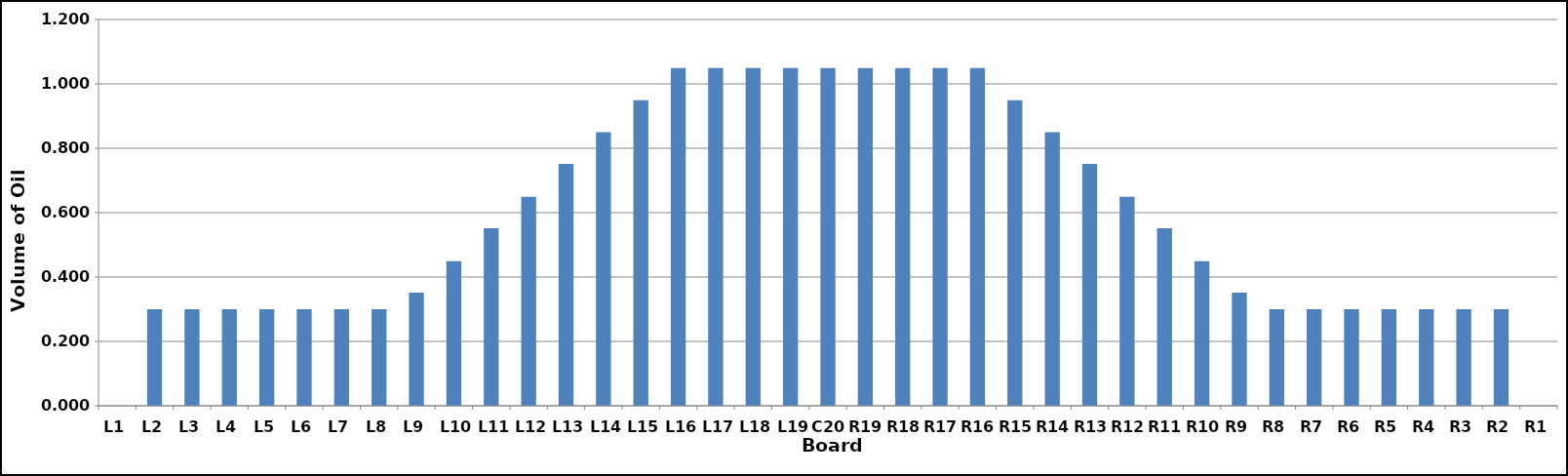
| Category | Series 0 |
|---|---|
| L1 | 0 |
| L2 | 0.3 |
| L3 | 0.3 |
| L4 | 0.3 |
| L5 | 0.3 |
| L6 | 0.3 |
| L7 | 0.3 |
| L8 | 0.3 |
| L9 | 0.351 |
| L10 | 0.449 |
| L11 | 0.552 |
| L12 | 0.649 |
| L13 | 0.752 |
| L14 | 0.85 |
| L15 | 0.949 |
| L16 | 1.05 |
| L17 | 1.05 |
| L18 | 1.05 |
| L19 | 1.05 |
| C20 | 1.05 |
| R19 | 1.05 |
| R18 | 1.05 |
| R17 | 1.05 |
| R16 | 1.05 |
| R15 | 0.949 |
| R14 | 0.85 |
| R13 | 0.752 |
| R12 | 0.649 |
| R11 | 0.552 |
| R10 | 0.449 |
| R9 | 0.351 |
| R8 | 0.3 |
| R7 | 0.3 |
| R6 | 0.3 |
| R5 | 0.3 |
| R4 | 0.3 |
| R3 | 0.3 |
| R2 | 0.3 |
| R1 | 0 |